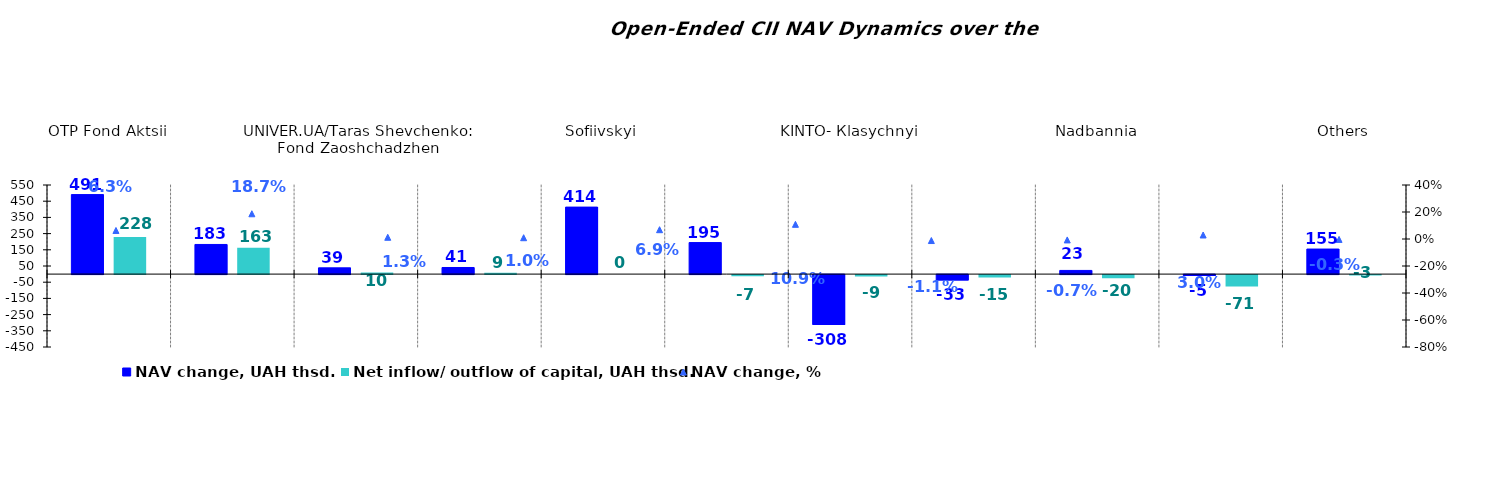
| Category | NAV change, UAH thsd. | Net inflow/ outflow of capital, UAH thsd. |
|---|---|---|
| ОТP Fond Aktsii | 490.78 | 228.292 |
| UNIVER.UA/Iaroslav Mudryi: Fond Aktsii | 182.957 | 163.287 |
| UNIVER.UA/Taras Shevchenko: Fond Zaoshchadzhen | 38.601 | 9.774 |
| UNIVER.UA/Myhailo Hrushevskyi: Fond Derzhavnykh Paperiv    | 40.762 | 8.656 |
| Sofiivskyi | 413.592 | 0 |
| KINTO-Kaznacheiskyi | 194.582 | -6.984 |
| KINTO- Кlasychnyi | -307.957 | -9.038 |
| KINTO-Ekviti | -33.056 | -14.572 |
| Nadbannia | 22.695 | -19.931 |
| VSI | -5.27 | -71.046 |
| Others | 154.56 | -2.885 |